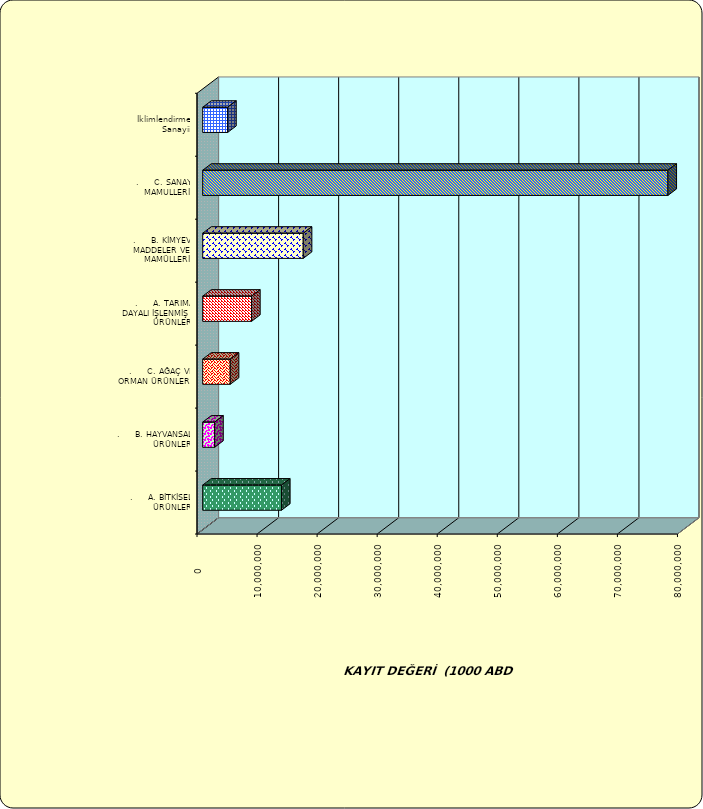
| Category | Series 0 |
|---|---|
| .     A. BİTKİSEL ÜRÜNLER | 13120929.12 |
| .     B. HAYVANSAL ÜRÜNLER | 1994106.937 |
| .     C. AĞAÇ VE ORMAN ÜRÜNLERİ | 4588330.926 |
| .     A. TARIMA DAYALI İŞLENMİŞ ÜRÜNLER | 8136533.296 |
| .     B. KİMYEVİ MADDELER VE MAMÜLLERİ | 16743322.693 |
| .     C. SANAYİ MAMULLERİ | 77465963.888 |
|  İklimlendirme Sanayii | 4153316.237 |